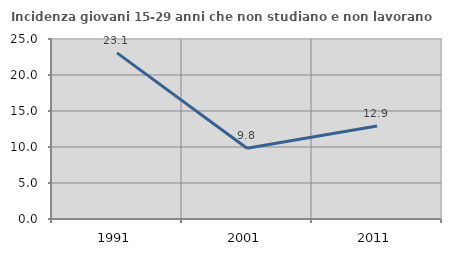
| Category | Incidenza giovani 15-29 anni che non studiano e non lavorano  |
|---|---|
| 1991.0 | 23.077 |
| 2001.0 | 9.828 |
| 2011.0 | 12.918 |